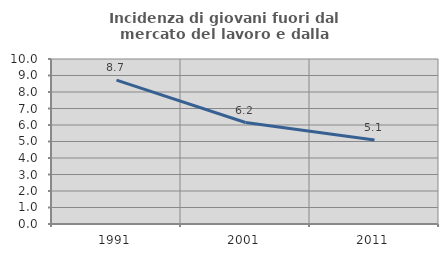
| Category | Incidenza di giovani fuori dal mercato del lavoro e dalla formazione  |
|---|---|
| 1991.0 | 8.717 |
| 2001.0 | 6.15 |
| 2011.0 | 5.09 |